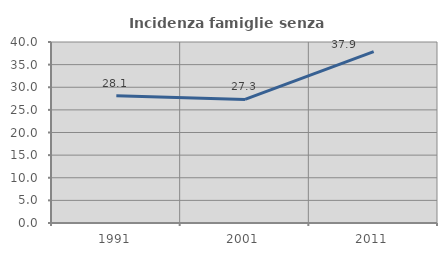
| Category | Incidenza famiglie senza nuclei |
|---|---|
| 1991.0 | 28.131 |
| 2001.0 | 27.308 |
| 2011.0 | 37.884 |